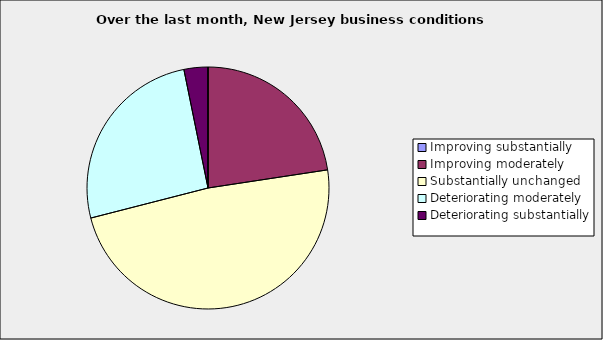
| Category | Series 0 |
|---|---|
| Improving substantially | 0 |
| Improving moderately | 0.226 |
| Substantially unchanged | 0.484 |
| Deteriorating moderately | 0.258 |
| Deteriorating substantially | 0.032 |